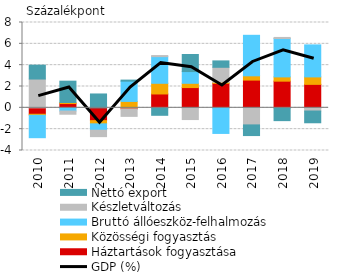
| Category | Háztartások fogyasztása | Közösségi fogyasztás | Bruttó állóeszköz-felhalmozás  | Készletváltozás  | Nettó export |
|---|---|---|---|---|---|
| 2010.0 | -0.6 | -0.1 | -2.1 | 2.7 | 1.3 |
| 2011.0 | 0.4 | 0.1 | -0.3 | -0.3 | 2 |
| 2012.0 | -1.2 | -0.3 | -0.6 | -0.6 | 1.3 |
| 2013.0 | -0.1 | 0.6 | 1.9 | -0.7 | 0.1 |
| 2014.0 | 1.3 | 1 | 2.5 | 0.1 | -0.7 |
| 2015.0 | 1.9 | 0.4 | 1.1 | -1.1 | 1.6 |
| 2016.0 | 2.3 | 0.1 | -2.4 | 1.4 | 0.6 |
| 2017.0 | 2.6 | 0.4 | 3.8 | -1.6 | -1 |
| 2018.0 | 2.5 | 0.4 | 3.6 | 0.1 | -1.2 |
| 2019.0 | 2.2 | 0.7 | 3 | -0.3 | -1.1 |